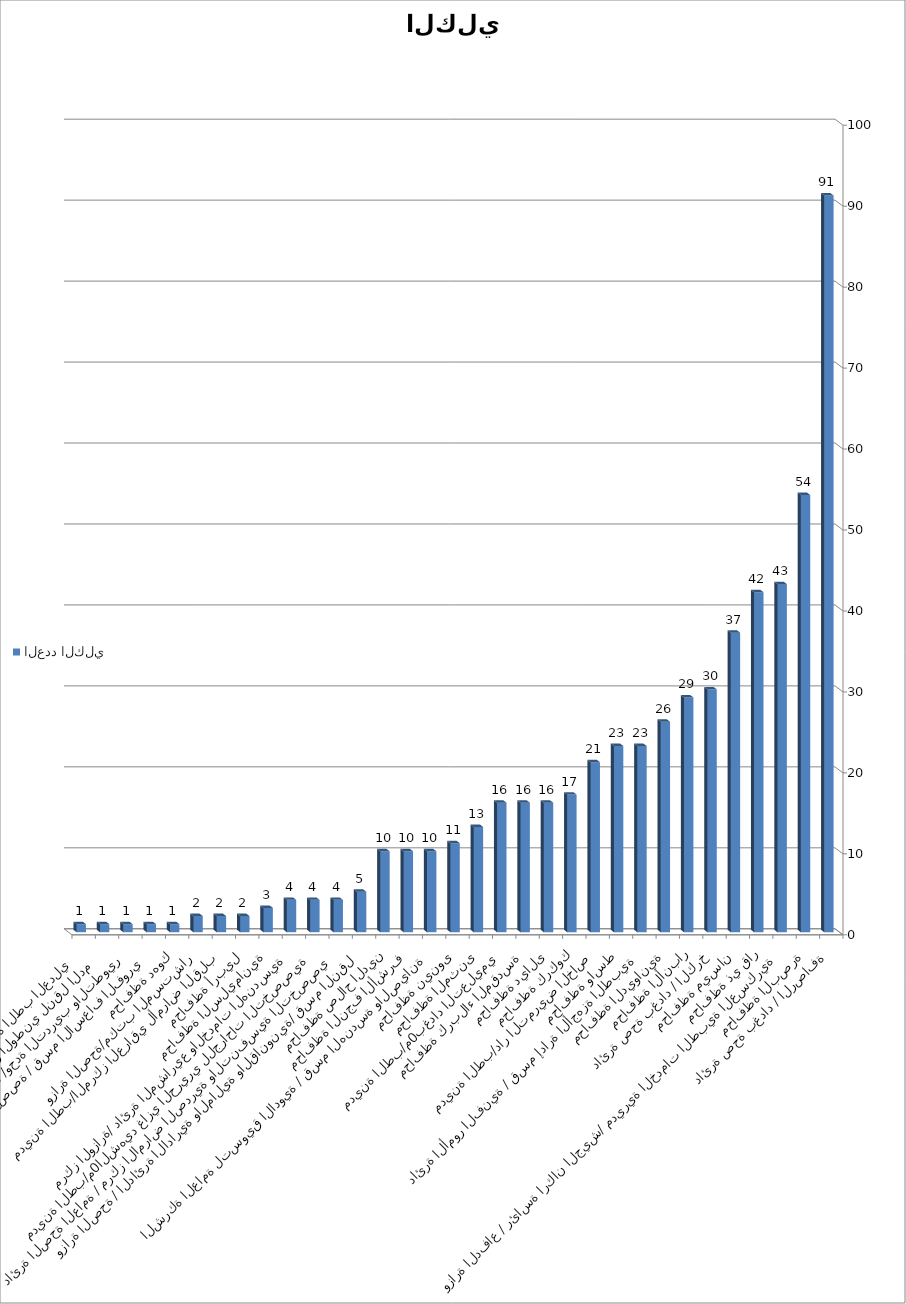
| Category | العدد الكلي |
|---|---|
| دائرة صحة بغداد / الرصافة | 91 |
| محافظة البصرة | 54 |
| وزارة الدفاع / رئاسة اركان الجيش/ مديرية الخدمات الطبية العسكرية | 43 |
| محافظة ذي قار | 42 |
| محافظة ميسان | 37 |
| دائرة صحة بغداد / الكرخ | 30 |
| محافظة الأنبار | 29 |
| محافظة الديوانية | 26 |
| دائرة الأمور الفنية / قسم إدارة الأجهزة الطبية | 23 |
| محافظة واسط | 23 |
| مدينة الطب/دار التمريض الخاص | 21 |
| محافظة كركوك | 17 |
| محافظة ديالى | 16 |
| محافظة كربلاء المقدسة | 16 |
| مدينة الطب/م0بغداد التعليمي | 16 |
| محافظة المثنى | 13 |
| محافظة نينوى | 11 |
| الشركة العامة لتسويق الادوية / قسم الهندسة والصيانة | 10 |
| محافظة النجف الأشرف | 10 |
| محافظة صلاح الدين | 10 |
| وزارة الصحة / الدائرة الادارية والمالية والقانونية/ قسم النقل | 5 |
| دائرة الصحة العامة / مركز الامراض الصدرية والتنفسية التخصصي | 4 |
| مدينة الطب/م0الشهيد غازي الحريري للجراحات التخصصية | 4 |
| مركز الوزارة/ دائرة المشاريع والخدمات الهندسية | 4 |
| محافظة السليمانية | 3 |
| محافظة أربيل | 2 |
| مدينة الطب/المركز العراقي لأمراض القلب | 2 |
| وزارة الصحة/مكتب المستشار | 2 |
| محافظة دهوك | 1 |
| مدينة الطب/دائرة العمليات الطبية والخدمات المتخصصة / قسم الاسعاف الفوري | 1 |
| وزارة الصحة/دائرة الصحة العامة /وحدة التدريب والتطوير | 1 |
| وزارة الصحة/دائرة العمليات والخدمات المتخصصة/ المركز الوطني لنقل الدم | 1 |
| وزارة الصحة/مكتب الوزير/دائرة الطب العدلي  | 1 |